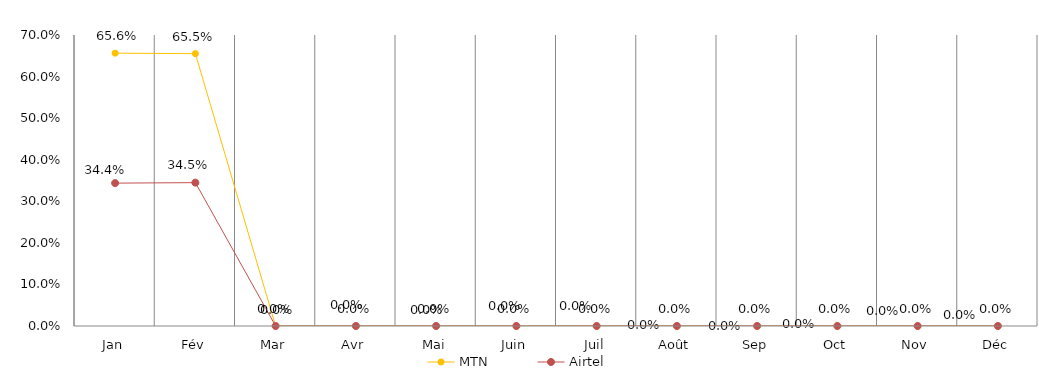
| Category | MTN | Airtel |
|---|---|---|
| Jan | 0.656 | 0.344 |
| Fév | 0.655 | 0.345 |
| Mar | 0 | 0 |
| Avr | 0 | 0 |
| Mai | 0 | 0 |
| Juin | 0 | 0 |
| Juil | 0 | 0 |
| Août | 0 | 0 |
| Sep | 0 | 0 |
| Oct | 0 | 0 |
| Nov | 0 | 0 |
| Déc | 0 | 0 |